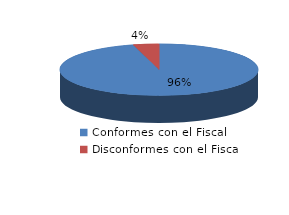
| Category | Series 0 |
|---|---|
| 0 | 1206 |
| 1 | 53 |